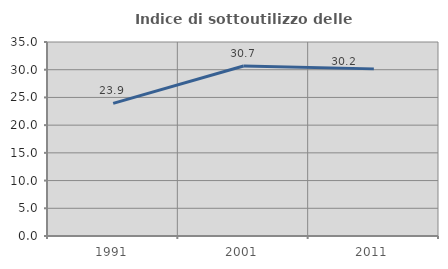
| Category | Indice di sottoutilizzo delle abitazioni  |
|---|---|
| 1991.0 | 23.925 |
| 2001.0 | 30.669 |
| 2011.0 | 30.151 |